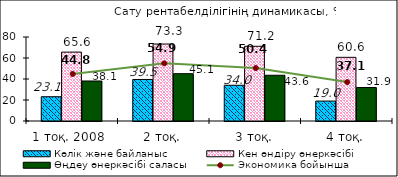
| Category | Көлік және байланыс | Кен өндіру өнеркәсібі | Өңдеу өнеркәсібі саласы |
|---|---|---|---|
| 1 тоқ. 2008  | 23.122 | 65.616 | 38.105 |
| 2 тоқ. | 39.55 | 73.293 | 45.074 |
| 3 тоқ. | 34.023 | 71.17 | 43.565 |
| 4 тоқ. | 18.983 | 60.627 | 31.884 |